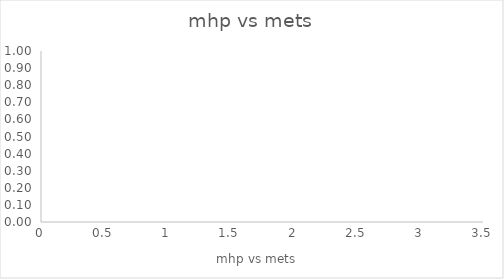
| Category | mhp vs mets |
|---|---|
| 2.519857940821257 | 0 |
| 2.1743801932367153 | 0 |
| 2.513056829710146 | 0 |
| 2.742905519323672 | 0 |
| 3.26412020531401 | 0 |
| 2.857862028985508 | 0 |
| 3.3172232729468605 | 0 |